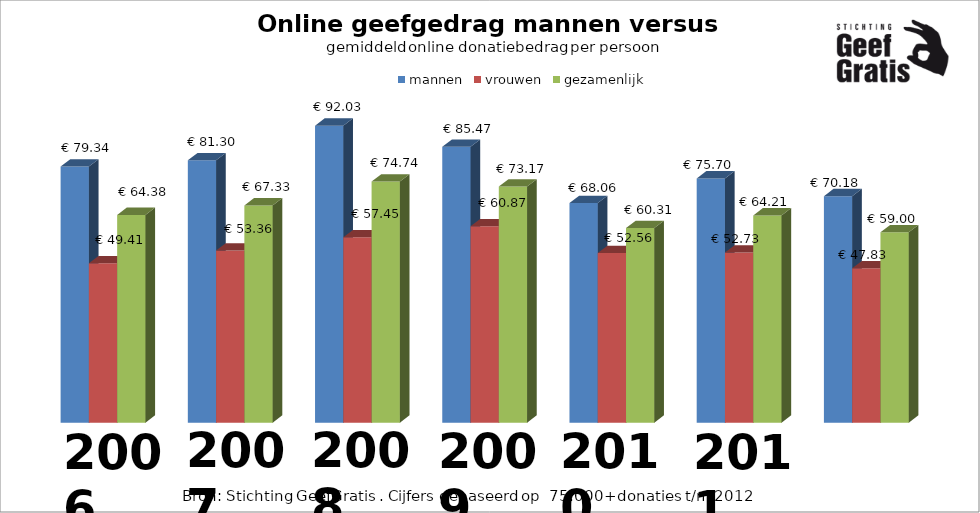
| Category | mannen | vrouwen | gezamenlijk |
|---|---|---|---|
| 0 | 79.342 | 49.409 | 64.376 |
| 1 | 81.298 | 53.36 | 67.329 |
| 2 | 92.026 | 57.453 | 74.74 |
| 3 | 85.472 | 60.868 | 73.17 |
| 4 | 68.062 | 52.559 | 60.31 |
| 5 | 75.697 | 52.732 | 64.215 |
| 6 | 70.179 | 47.829 | 59.004 |